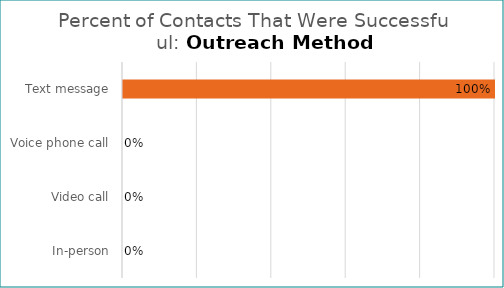
| Category | Percent Successful |
|---|---|
| Text message | 1 |
| Voice phone call | 0 |
| Video call | 0 |
| In-person | 0 |